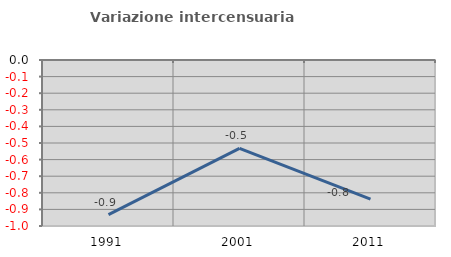
| Category | Variazione intercensuaria annua |
|---|---|
| 1991.0 | -0.932 |
| 2001.0 | -0.533 |
| 2011.0 | -0.838 |